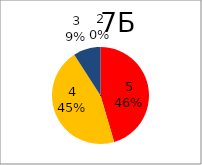
| Category | Series 0 |
|---|---|
| 5.0 | 5 |
| 4.0 | 5 |
| 3.0 | 1 |
| 2.0 | 0 |